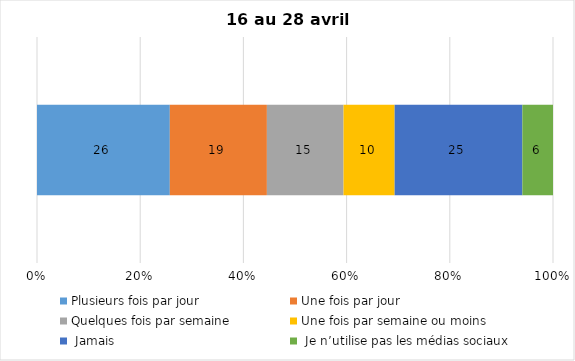
| Category | Plusieurs fois par jour | Une fois par jour | Quelques fois par semaine   | Une fois par semaine ou moins   |  Jamais   |  Je n’utilise pas les médias sociaux |
|---|---|---|---|---|---|---|
| 0 | 26 | 19 | 15 | 10 | 25 | 6 |